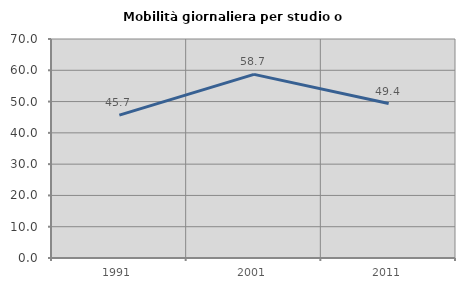
| Category | Mobilità giornaliera per studio o lavoro |
|---|---|
| 1991.0 | 45.652 |
| 2001.0 | 58.696 |
| 2011.0 | 49.375 |